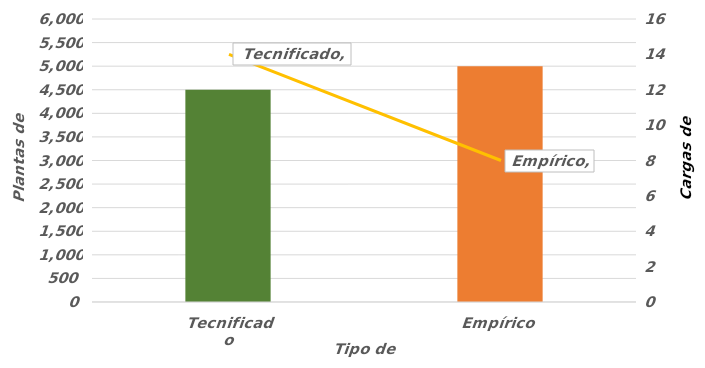
| Category | Total Plantas de Café |
|---|---|
| Tecnificado | 4500 |
| Empírico | 5000 |